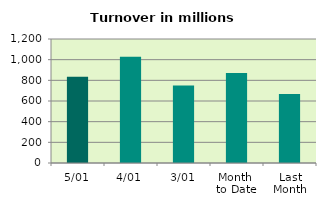
| Category | Series 0 |
|---|---|
| 5/01 | 834.388 |
| 4/01 | 1027.233 |
| 3/01 | 751.196 |
| Month 
to Date | 870.939 |
| Last
Month | 667.375 |